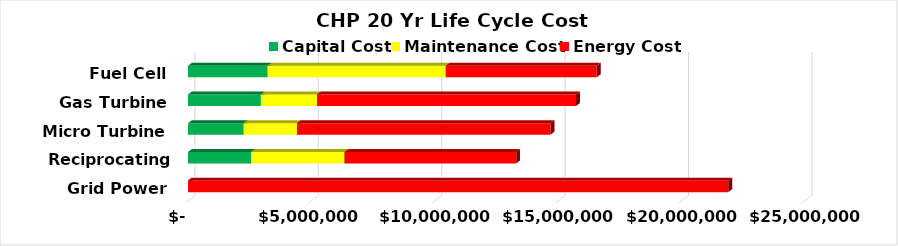
| Category | Capital Cost | Maintenance Cost | Energy Cost |
|---|---|---|---|
| Grid Power | 0 | 0 | 21886889.971 |
| Reciprocating Engine | 2553300 | 3791672.488 | 6949522.693 |
| Micro Turbine | 2250000 | 2166669.993 | 10268680.604 |
| Gas Turbine | 2952900 | 2275003.493 | 10495094.679 |
| Fuel Cell | 3220000 | 7222233.31 | 6117231.614 |